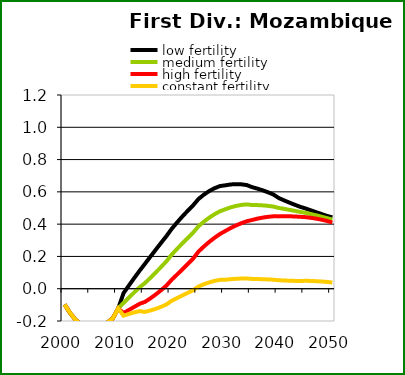
| Category | low fertility | medium fertility | high fertility | constant fertility |
|---|---|---|---|---|
| 2000.0 | -0.098 | -0.098 | -0.098 | -0.098 |
| 2001.0 | -0.15 | -0.15 | -0.15 | -0.15 |
| 2002.0 | -0.191 | -0.191 | -0.191 | -0.191 |
| 2003.0 | -0.221 | -0.221 | -0.221 | -0.221 |
| 2004.0 | -0.239 | -0.239 | -0.239 | -0.239 |
| 2005.0 | -0.238 | -0.238 | -0.238 | -0.238 |
| 2006.0 | -0.236 | -0.236 | -0.236 | -0.236 |
| 2007.0 | -0.227 | -0.227 | -0.227 | -0.227 |
| 2008.0 | -0.209 | -0.209 | -0.209 | -0.209 |
| 2009.0 | -0.183 | -0.183 | -0.183 | -0.183 |
| 2010.0 | -0.122 | -0.122 | -0.122 | -0.122 |
| 2011.0 | -0.027 | -0.088 | -0.151 | -0.167 |
| 2012.0 | 0.02 | -0.055 | -0.132 | -0.156 |
| 2013.0 | 0.066 | -0.023 | -0.113 | -0.147 |
| 2014.0 | 0.112 | 0.009 | -0.093 | -0.139 |
| 2015.0 | 0.154 | 0.035 | -0.081 | -0.143 |
| 2016.0 | 0.198 | 0.067 | -0.06 | -0.135 |
| 2017.0 | 0.241 | 0.1 | -0.036 | -0.125 |
| 2018.0 | 0.284 | 0.134 | -0.01 | -0.112 |
| 2019.0 | 0.326 | 0.17 | 0.019 | -0.098 |
| 2020.0 | 0.371 | 0.212 | 0.056 | -0.075 |
| 2021.0 | 0.411 | 0.247 | 0.088 | -0.058 |
| 2022.0 | 0.448 | 0.281 | 0.12 | -0.042 |
| 2023.0 | 0.483 | 0.315 | 0.153 | -0.025 |
| 2024.0 | 0.517 | 0.347 | 0.186 | -0.009 |
| 2025.0 | 0.556 | 0.387 | 0.23 | 0.014 |
| 2026.0 | 0.583 | 0.415 | 0.261 | 0.028 |
| 2027.0 | 0.605 | 0.44 | 0.29 | 0.039 |
| 2028.0 | 0.623 | 0.462 | 0.316 | 0.048 |
| 2029.0 | 0.636 | 0.48 | 0.339 | 0.055 |
| 2030.0 | 0.64 | 0.492 | 0.357 | 0.056 |
| 2031.0 | 0.646 | 0.504 | 0.376 | 0.059 |
| 2032.0 | 0.648 | 0.513 | 0.392 | 0.062 |
| 2033.0 | 0.647 | 0.519 | 0.406 | 0.063 |
| 2034.0 | 0.642 | 0.522 | 0.418 | 0.063 |
| 2035.0 | 0.629 | 0.519 | 0.426 | 0.061 |
| 2036.0 | 0.62 | 0.518 | 0.434 | 0.06 |
| 2037.0 | 0.609 | 0.516 | 0.441 | 0.059 |
| 2038.0 | 0.597 | 0.513 | 0.445 | 0.058 |
| 2039.0 | 0.583 | 0.509 | 0.449 | 0.056 |
| 2040.0 | 0.562 | 0.5 | 0.448 | 0.053 |
| 2041.0 | 0.547 | 0.495 | 0.449 | 0.051 |
| 2042.0 | 0.533 | 0.488 | 0.449 | 0.05 |
| 2043.0 | 0.52 | 0.482 | 0.447 | 0.048 |
| 2044.0 | 0.507 | 0.476 | 0.445 | 0.048 |
| 2045.0 | 0.497 | 0.47 | 0.443 | 0.049 |
| 2046.0 | 0.485 | 0.462 | 0.439 | 0.048 |
| 2047.0 | 0.474 | 0.455 | 0.434 | 0.047 |
| 2048.0 | 0.462 | 0.446 | 0.427 | 0.045 |
| 2049.0 | 0.451 | 0.437 | 0.42 | 0.042 |
| 2050.0 | 0.442 | 0.428 | 0.41 | 0.038 |